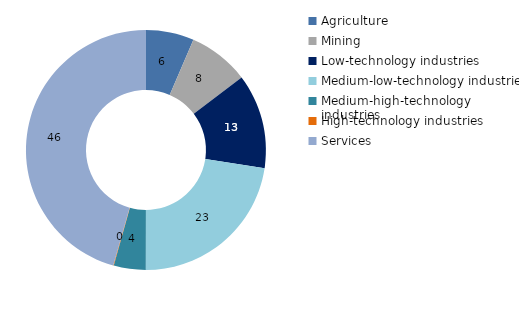
| Category | 1995 |
|---|---|
| Agriculture | 6.464 |
| Mining | 8.194 |
| Low-technology industries | 12.766 |
| Medium-low-technology industries | 22.602 |
| Medium-high-technology industries | 4.304 |
| High-technology industries | 0.08 |
| Services | 45.59 |